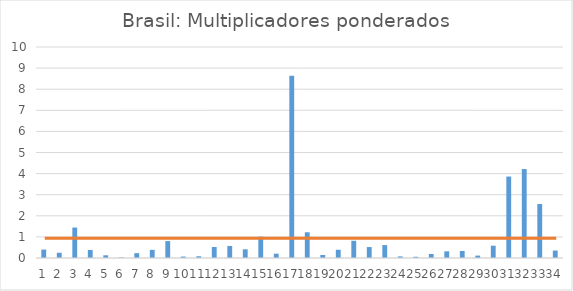
| Category | Series 0 |
|---|---|
| 0 | 0.4 |
| 1 | 0.248 |
| 2 | 1.443 |
| 3 | 0.38 |
| 4 | 0.129 |
| 5 | 0.025 |
| 6 | 0.228 |
| 7 | 0.385 |
| 8 | 0.801 |
| 9 | 0.069 |
| 10 | 0.083 |
| 11 | 0.522 |
| 12 | 0.571 |
| 13 | 0.413 |
| 14 | 1.012 |
| 15 | 0.204 |
| 16 | 8.639 |
| 17 | 1.219 |
| 18 | 0.141 |
| 19 | 0.391 |
| 20 | 0.816 |
| 21 | 0.519 |
| 22 | 0.612 |
| 23 | 0.075 |
| 24 | 0.058 |
| 25 | 0.191 |
| 26 | 0.316 |
| 27 | 0.333 |
| 28 | 0.115 |
| 29 | 0.582 |
| 30 | 3.861 |
| 31 | 4.216 |
| 32 | 2.557 |
| 33 | 0.353 |